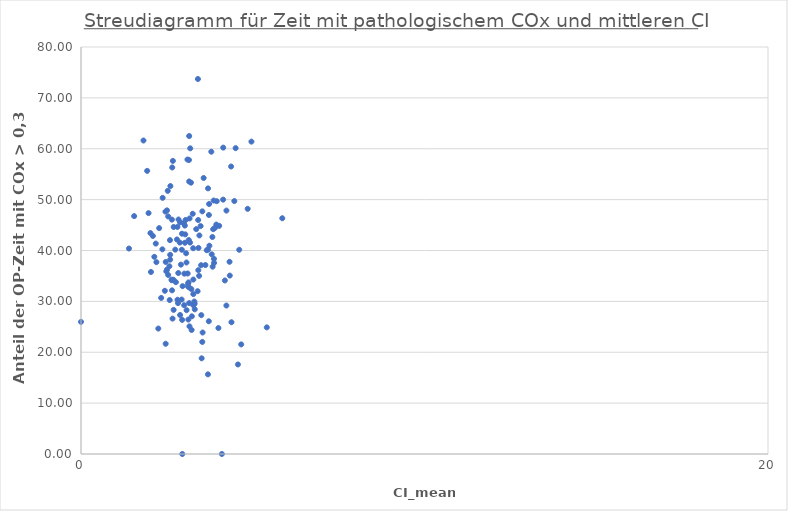
| Category | Cox_0.3_path |
|---|---|
| 0 | 24.658 |
| 1 | 60.081 |
| 2 | 53.571 |
| 3 | 47.692 |
| 4 | 40.23 |
| 5 | 43.304 |
| 6 | 36.25 |
| 7 | 40.446 |
| 8 | 51.724 |
| 9 | 53.333 |
| 10 | 35.78 |
| 11 | 55.652 |
| 12 | 38.2 |
| 13 | 47.35 |
| 14 | 44.44 |
| 15 | 49.69 |
| 16 | 37.64 |
| 17 | 30.32 |
| 18 | 59.42 |
| 19 | 47.85 |
| 20 | 25.9 |
| 21 | 37.56 |
| 22 | 62.5 |
| 23 | 0 |
| 24 | 29.26 |
| 25 | 45.99 |
| 26 | 32.99 |
| 27 | 29.25 |
| 28 | 26.36 |
| 29 | 27.3 |
| 30 | 29.54 |
| 31 | 31.43 |
| 32 | 35.57 |
| 33 | 34.25 |
| 34 | 35.01 |
| 35 | 43.42 |
| 36 | 41.36 |
| 37 | 37.22 |
| 38 | 42.17 |
| 39 | 44.4 |
| 40 | 42.04 |
| 41 | 26.43 |
| 42 | 26.09 |
| 43 | 39.15 |
| 44 | 39.25 |
| 45 | 0 |
| 46 | 41.56 |
| 47 | 39.46 |
| 48 | 35.45 |
| 49 | 50.35 |
| 50 | 18.81 |
| 51 | 33.78 |
| 52 | 30.68 |
| 53 | 30.26 |
| 54 | 29.97 |
| 55 | 40.94 |
| 56 | 36.13 |
| 57 | 43.17 |
| 58 | 44.2 |
| 59 | 44.63 |
| 60 | 38.36 |
| 61 | 34.16 |
| 62 | 29.66 |
| 63 | 32.96 |
| 64 | 49.14 |
| 65 | 35.48 |
| 66 | 42.06 |
| 67 | 44.8 |
| 68 | 24.76 |
| 69 | 46.69 |
| 70 | 57.61 |
| 71 | 40.16 |
| 72 | 44.9 |
| 73 | 57.88 |
| 74 | 38.76 |
| 75 | 35.07 |
| 76 | 28.44 |
| 77 | 46.09 |
| 78 | 57.79 |
| 79 | 60.22 |
| 80 | 44.19 |
| 81 | 40.17 |
| 82 | 40.39 |
| 83 | 23.88 |
| 84 | 44.62 |
| 85 | 56.32 |
| 86 | 34.27 |
| 87 | 28.33 |
| 88 | 47.22 |
| 89 | 37.71 |
| 90 | 32.08 |
| 91 | 30.36 |
| 92 | 45.36 |
| 93 | 36.9 |
| 94 | 34.29 |
| 95 | 29.18 |
| 96 | 32.17 |
| 97 | 61.62 |
| 98 | 42.96 |
| 99 | 47.89 |
| 100 | 35.19 |
| 101 | 37.14 |
| 102 | 27.06 |
| 103 | 46 |
| 104 | 49.72 |
| 105 | 40.06 |
| 106 | 40.14 |
| 107 | 46.98 |
| 108 | 21.54 |
| 109 | 33.47 |
| 110 | 45.53 |
| 111 | 46.3 |
| 112 | 26.61 |
| 113 | 21.67 |
| 114 | 50 |
| 115 | 46.34 |
| 116 | 24.38 |
| 117 | 37.75 |
| 118 | 32.41 |
| 119 | 28.27 |
| 120 | 42.65 |
| 121 | 37.78 |
| 122 | 36.82 |
| 123 | 41.52 |
| 124 | 37.11 |
| 125 | 35.91 |
| 126 | 42.86 |
| 127 | 17.6 |
| 128 | 44.84 |
| 129 | 48.19 |
| 130 | 47.64 |
| 131 | 27.32 |
| 132 | 32 |
| 133 | 52.21 |
| 134 | 46.76 |
| 135 | 34.11 |
| 136 | 24.89 |
| 137 | 40.14 |
| 138 | 25.09 |
| 139 | 33.73 |
| 140 | 52.67 |
| 141 | 45.1 |
| 142 | 41.56 |
| 143 | 25.97 |
| 144 | 54.25 |
| 145 | 15.66 |
| 146 | 22.03 |
| 147 | 46.07 |
| 148 | 32.78 |
| 149 | 61.4 |
| 150 | 73.71 |
| 151 | 29.66 |
| 152 | 56.51 |
| 153 | 60.12 |
| 154 | 40.51 |
| 155 | 49.82 |